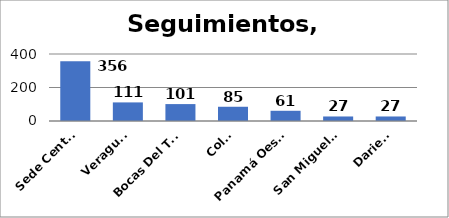
| Category | Series 0 |
|---|---|
| Sede Central | 356 |
| Veraguas  | 111 |
| Bocas Del Toro | 101 |
| Colón | 85 |
| Panamá Oeste  | 61 |
| San Miguelito | 27 |
| Darien  | 27 |